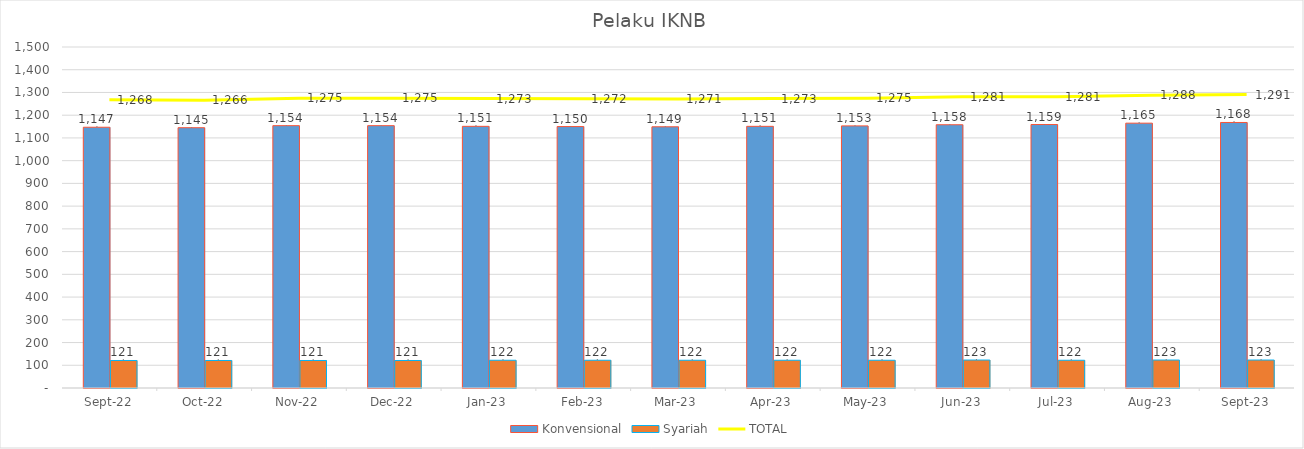
| Category |  Konvensional  |  Syariah  |
|---|---|---|
| 2022-09-01 | 1147 | 121 |
| 2022-10-01 | 1145 | 121 |
| 2022-11-01 | 1154 | 121 |
| 2022-12-01 | 1154 | 121 |
| 2023-01-01 | 1151 | 122 |
| 2023-02-01 | 1150 | 122 |
| 2023-03-01 | 1149 | 122 |
| 2023-04-01 | 1151 | 122 |
| 2023-05-01 | 1153 | 122 |
| 2023-06-01 | 1158 | 123 |
| 2023-07-01 | 1159 | 122 |
| 2023-08-01 | 1165 | 123 |
| 2023-09-01 | 1168 | 123 |